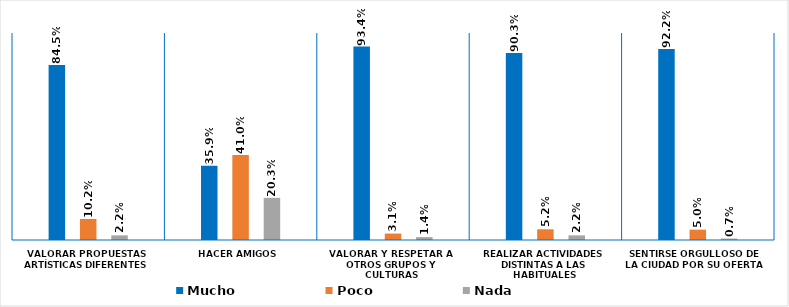
| Category | Mucho | Poco | Nada |
|---|---|---|---|
| Valorar propuestas artísticas diferentes | 0.845 | 0.102 | 0.022 |
| Hacer amigos | 0.359 | 0.41 | 0.203 |
| Valorar y respetar a otros grupos y culturas | 0.934 | 0.031 | 0.014 |
| Realizar actividades distintas a las habituales | 0.903 | 0.052 | 0.022 |
| Sentirse orgulloso de la ciudad por su oferta  | 0.922 | 0.05 | 0.007 |